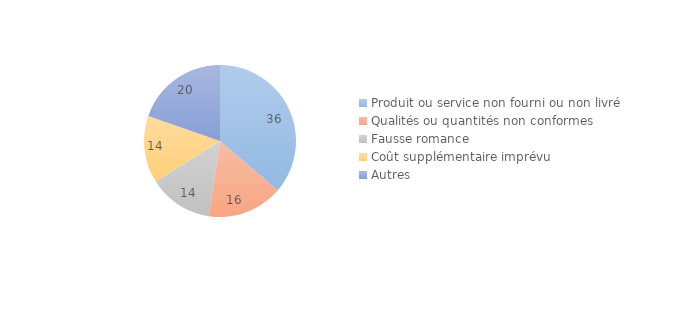
| Category | Series 0 |
|---|---|
| Produit ou service non fourni ou non livré | 36.15 |
| Qualités ou quantités non conformes | 16 |
| Fausse romance | 13.59 |
| Coût supplémentaire imprévu | 14.26 |
| Autres | 19.56 |